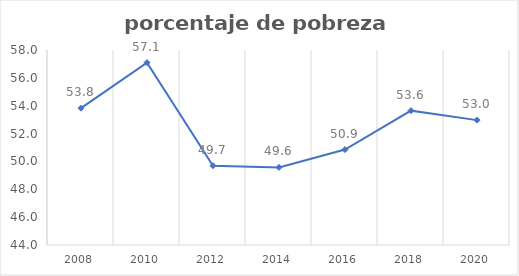
| Category | Series 0 |
|---|---|
| 2008.0 | 53.824 |
| 2010.0 | 57.096 |
| 2012.0 | 49.69 |
| 2014.0 | 49.571 |
| 2016.0 | 50.852 |
| 2018.0 | 53.646 |
| 2020.0 | 52.965 |